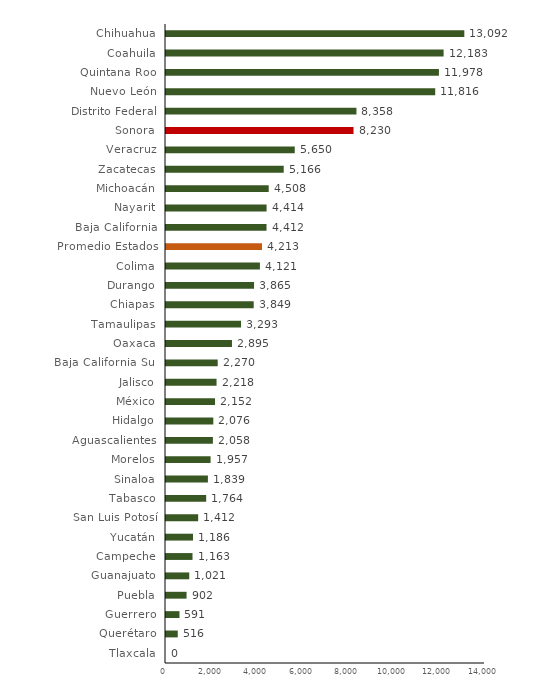
| Category | Gasto percápita |
|---|---|
| Tlaxcala | 0 |
| Querétaro | 515.87 |
| Guerrero | 591.211 |
| Puebla | 902.449 |
| Guanajuato | 1020.664 |
| Campeche | 1163.415 |
| Yucatán | 1185.848 |
| San Luis Potosí | 1411.567 |
| Tabasco | 1763.532 |
| Sinaloa | 1838.89 |
| Morelos | 1956.841 |
| Aguascalientes | 2057.805 |
| Hidalgo | 2075.966 |
| México | 2151.869 |
| Jalisco | 2218.325 |
| Baja California Sur | 2269.759 |
| Oaxaca | 2895.041 |
| Tamaulipas | 3292.562 |
| Chiapas | 3848.939 |
| Durango | 3864.528 |
| Colima | 4121.333 |
| Promedio Estados | 4212.598 |
| Baja California | 4411.584 |
| Nayarit | 4413.64 |
| Michoacán | 4507.532 |
| Zacatecas | 5165.716 |
| Veracruz | 5650.252 |
| Sonora | 8230.156 |
| Distrito Federal | 8357.959 |
| Nuevo León | 11815.734 |
| Quintana Roo | 11977.662 |
| Coahuila | 12183.469 |
| Chihuahua | 13092.402 |